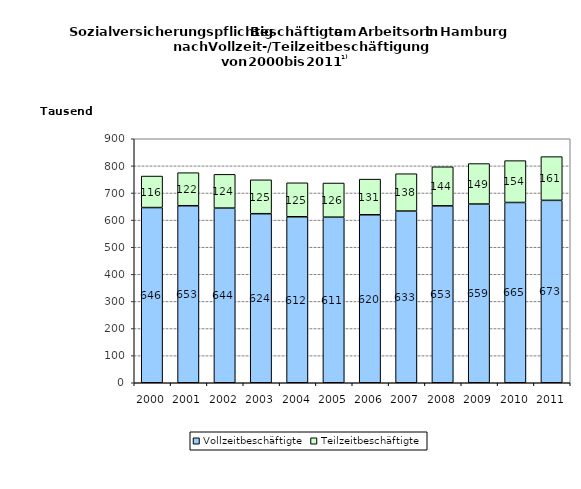
| Category | Vollzeitbeschäftigte | Teilzeitbeschäftigte |
|---|---|---|
| 2000.0 | 646215 | 116256 |
| 2001.0 | 652961 | 121908 |
| 2002.0 | 644260 | 124427 |
| 2003.0 | 623539 | 125008 |
| 2004.0 | 612277 | 125285 |
| 2005.0 | 610795 | 125982 |
| 2006.0 | 619667 | 131459 |
| 2007.0 | 633311 | 137751 |
| 2008.0 | 652533 | 144061 |
| 2009.0 | 659237 | 149283 |
| 2010.0 | 664956 | 154370 |
| 2011.0 | 672796 | 161285 |